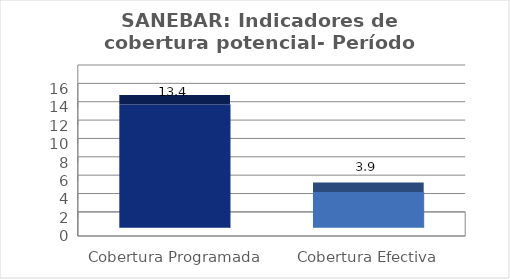
| Category | Series 0 |
|---|---|
| Cobertura Programada | 13.426 |
| Cobertura Efectiva | 3.898 |